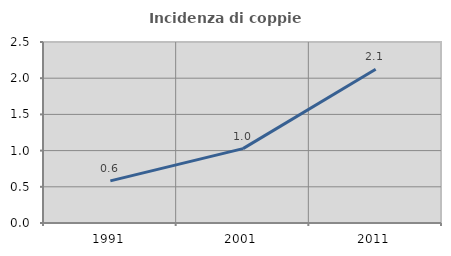
| Category | Incidenza di coppie miste |
|---|---|
| 1991.0 | 0.582 |
| 2001.0 | 1.028 |
| 2011.0 | 2.124 |